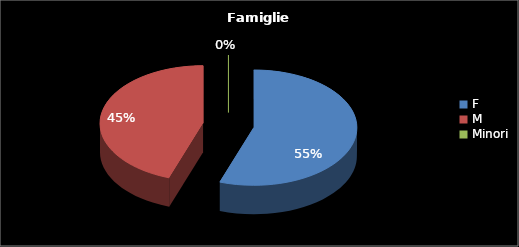
| Category | Series 0 |
|---|---|
| F | 109 |
| M | 88 |
| Minori | 0 |